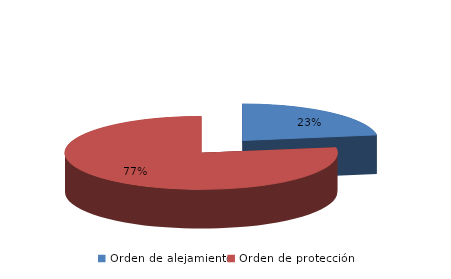
| Category | Series 0 |
|---|---|
| Orden de alejamiento | 71 |
| Orden de protección | 244 |